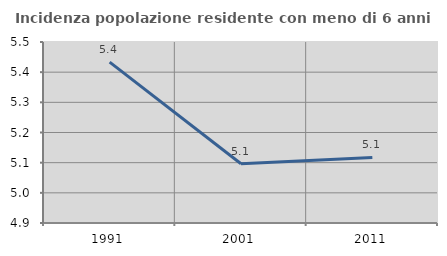
| Category | Incidenza popolazione residente con meno di 6 anni |
|---|---|
| 1991.0 | 5.433 |
| 2001.0 | 5.097 |
| 2011.0 | 5.117 |